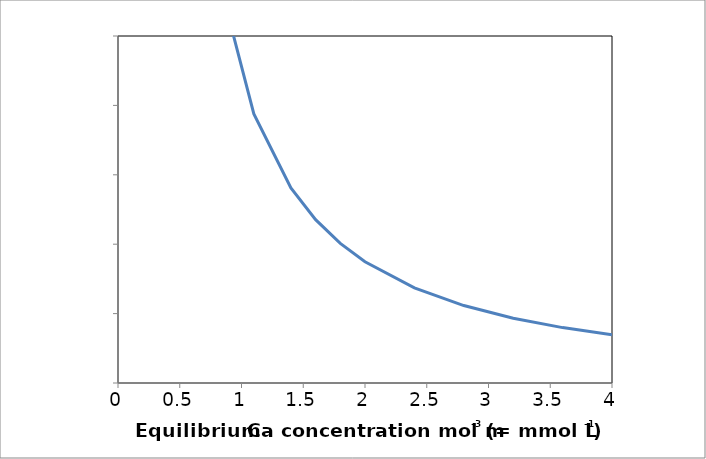
| Category | Series 0 |
|---|---|
| 0.7999999999999999 | 59297.104 |
| 1.1 | 38781.972 |
| 1.4 | 28117.892 |
| 1.5999999999999999 | 23532.071 |
| 1.7999999999999998 | 20112.071 |
| 2.0 | 17476.192 |
| 2.4 | 13704.772 |
| 2.8 | 11158.593 |
| 3.1999999999999997 | 9338.709 |
| 3.5999999999999996 | 7981.481 |
| 4.0 | 6935.431 |
| 4.0 | 6935.431 |